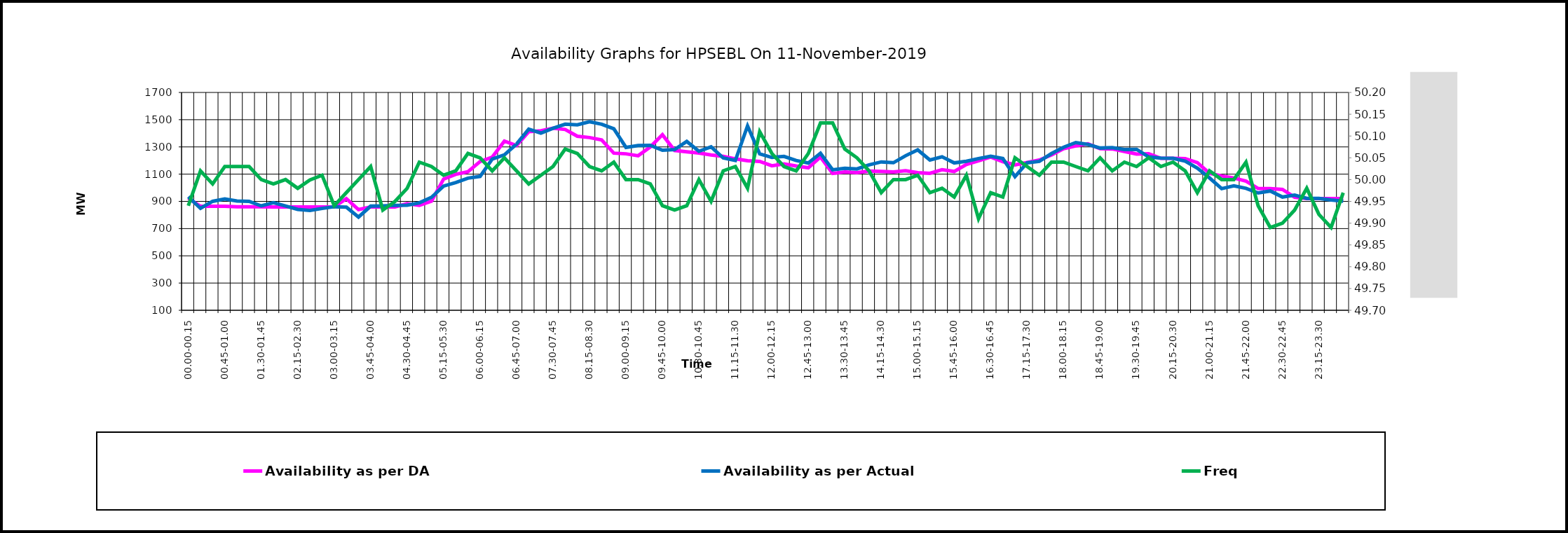
| Category | Availability as per DA | Availability as per Actual |
|---|---|---|
| 00.00-00.15 | 922.612 | 934.005 |
| 00.15-00.30 | 863.386 | 848.737 |
| 00.30-00.45 | 863.386 | 900.267 |
| 00.45-01.00 | 863.386 | 917.634 |
| 01.00-01.15 | 860.141 | 902.648 |
| 01.15-01.30 | 860.141 | 900.611 |
| 01.30-01.45 | 860.141 | 866.731 |
| 01.45-02:00 | 859.367 | 890.049 |
| 02.00-02.15 | 859.267 | 866.049 |
| 02.15-02.30 | 859.267 | 841.286 |
| 02.30-02.45 | 859.267 | 832.89 |
| 02.45-03:00 | 859.267 | 847.88 |
| 03.00-03.15 | 859.636 | 860.722 |
| 03.15-03.30 | 919.255 | 857.341 |
| 03.30-03.45 | 839.255 | 784.381 |
| 03.45-04.00 | 859.255 | 864.865 |
| 04.00-04.15 | 859.155 | 866.916 |
| 04.15-04.30 | 859.155 | 870.916 |
| 04.30-04.45 | 882.937 | 871.566 |
| 04.45-05.00 | 870.996 | 889.309 |
| 05.00-05.15 | 901.112 | 929.713 |
| 05.15-05.30 | 1063.875 | 1012.279 |
| 05.30-05.45 | 1098.531 | 1038.782 |
| 05.45-06.00 | 1117.335 | 1070.517 |
| 06.00-06.15 | 1192.506 | 1083.56 |
| 06.15-06.30 | 1225.088 | 1210.988 |
| 06.30-06.45 | 1342.89 | 1242.085 |
| 06.45-07.00 | 1310.067 | 1320.851 |
| 07.00-07.15 | 1411.242 | 1430.047 |
| 07.15-07.30 | 1418.46 | 1401.744 |
| 07.30-07.45 | 1437.088 | 1437.047 |
| 07.45-08.00 | 1428.086 | 1466.744 |
| 08.00-08.15 | 1378.182 | 1462.19 |
| 08.15-08.30 | 1368.927 | 1484.79 |
| 08.30-08.45 | 1351.54 | 1466.877 |
| 08.45-09.00 | 1254.271 | 1433.102 |
| 09.00-09.15 | 1249.182 | 1296.52 |
| 09.15-09.30 | 1235.171 | 1310.498 |
| 09.30-09.45 | 1299.873 | 1311.783 |
| 09.45-10.00 | 1389.49 | 1275.424 |
| 10.00-10.15 | 1274.196 | 1280.361 |
| 10.15-10.30 | 1264.223 | 1340.1 |
| 10.30-10.45 | 1255.291 | 1267.926 |
| 10.45-11.00 | 1240.97 | 1300.347 |
| 11.00-11.15 | 1230.221 | 1218.816 |
| 11.15-11.30 | 1212.075 | 1200.095 |
| 11.30-11.45 | 1198.027 | 1454.375 |
| 11.45-12.00 | 1193.723 | 1249.035 |
| 12.00-12.15 | 1161.246 | 1222.356 |
| 12.15-12.30 | 1174.733 | 1230.312 |
| 12.30-12.45 | 1159.457 | 1199.927 |
| 12.45-13.00 | 1146.547 | 1181.637 |
| 13.00-13.15 | 1225.481 | 1252.92 |
| 13.15-13.30 | 1105.229 | 1131.749 |
| 13.30-13.45 | 1115.57 | 1142.666 |
| 13.45-14.00 | 1110.724 | 1138.45 |
| 14.00-14.15 | 1121.96 | 1168.008 |
| 14.15-14.30 | 1119.782 | 1189.794 |
| 14.30-14.45 | 1116.066 | 1183.917 |
| 14.45-15.00 | 1124.457 | 1235.107 |
| 15.00-15.15 | 1111.327 | 1277.906 |
| 15.15-15.30 | 1106.359 | 1203.381 |
| 15.30-15.45 | 1132.406 | 1227.539 |
| 15.45-16.00 | 1119.528 | 1182.555 |
| 16.00-16.15 | 1171.5 | 1194.777 |
| 16.15-16.30 | 1197.762 | 1214.616 |
| 16.30-16.45 | 1225.69 | 1231.595 |
| 16.45-17.00 | 1191.923 | 1214.906 |
| 17.00-17.15 | 1168.041 | 1081.364 |
| 17.15-17.30 | 1185.202 | 1183.376 |
| 17.30-17.45 | 1203.698 | 1193.964 |
| 17.45-18.00 | 1241.108 | 1250.957 |
| 18.00-18.15 | 1287.042 | 1297.75 |
| 18.15-18.30 | 1307.492 | 1332.068 |
| 18.30-18.45 | 1322.829 | 1318.503 |
| 18.45-19.00 | 1287.042 | 1291.663 |
| 19.00-19.15 | 1285.15 | 1294.862 |
| 19.15-19.30 | 1266.397 | 1280.281 |
| 19.30-19.45 | 1246.959 | 1282.115 |
| 19.45-20.00 | 1250.212 | 1226.682 |
| 20.00-20.15 | 1216.532 | 1217.22 |
| 20.15-20.30 | 1216.878 | 1216.497 |
| 20.30-20.45 | 1214.434 | 1195.347 |
| 20.45-21.00 | 1184.341 | 1144.327 |
| 21.00-21.15 | 1106.028 | 1072.274 |
| 21.15-21.30 | 1087.325 | 993.569 |
| 21.30-21.45 | 1071.298 | 1014.033 |
| 21.45-22.00 | 1048.151 | 996.041 |
| 22.00-22.15 | 994.627 | 961.827 |
| 22.15-22.30 | 994.345 | 976.253 |
| 22.30-22.45 | 988.056 | 931.93 |
| 22.45-23.00 | 930.615 | 945.737 |
| 23.00-23.15 | 920.615 | 922.2 |
| 23.15-23.30 | 920.481 | 921.925 |
| 23.30-23.45 | 920.487 | 910.548 |
| 23.45-24.00 | 920.487 | 901.508 |